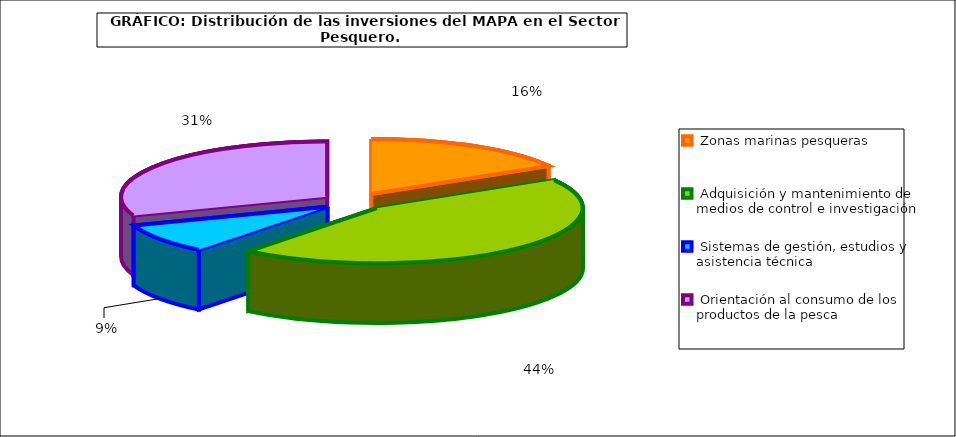
| Category | Series 0 |
|---|---|
|  Zonas marinas pesqueras | 4495.8 |
|  Adquisición y mantenimiento de medios de control e investigación  | 12088.7 |
|  Sistemas de gestión, estudios y asistencia técnica | 2380.07 |
|  Orientación al consumo de los productos de la pesca | 8347.25 |